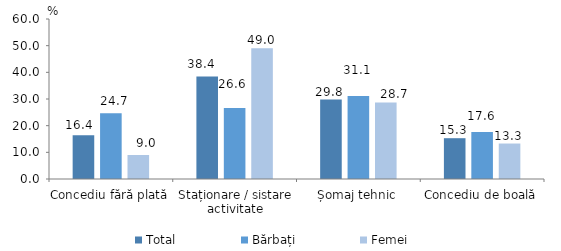
| Category | Total | Bărbați | Femei |
|---|---|---|---|
| Concediu fără plată | 16.4 | 24.7 | 9 |
| Staționare / sistare activitate | 38.4 | 26.6 | 49 |
| Șomaj tehnic | 29.8 | 31.1 | 28.7 |
| Concediu de boală | 15.3 | 17.6 | 13.3 |